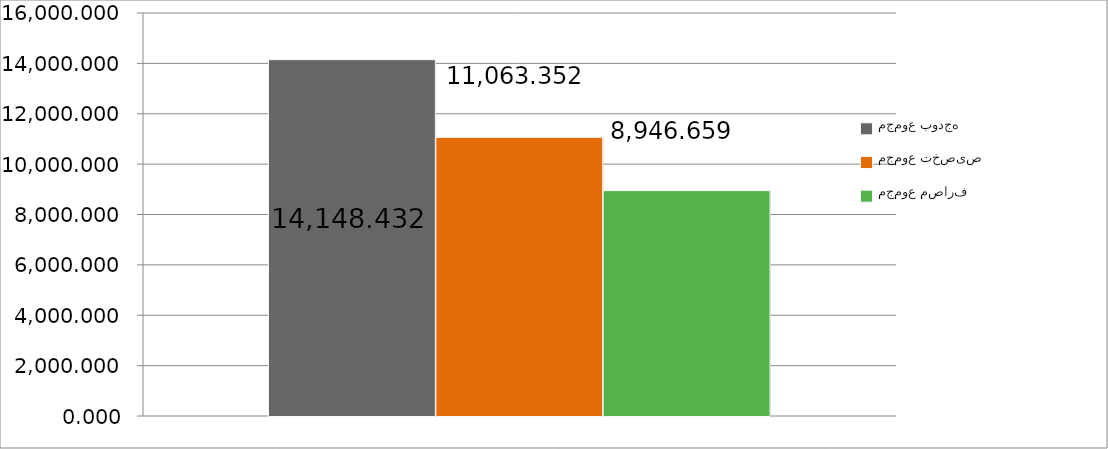
| Category | مجموع بودجه  | مجموع تخصیص | مجموع مصارف |
|---|---|---|---|
| 0 | 14148.432 | 11063.352 | 8946.659 |